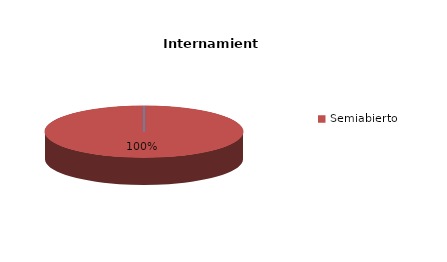
| Category | Series 0 |
|---|---|
| Cerrado | 0 |
| Semiabierto | 1 |
| Abierto | 0 |
| Terapeúticos | 0 |